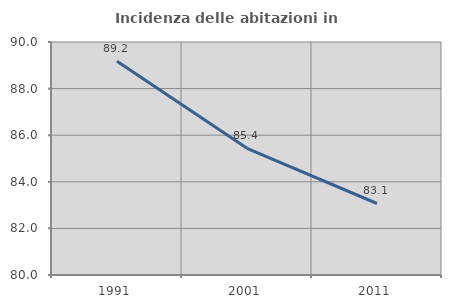
| Category | Incidenza delle abitazioni in proprietà  |
|---|---|
| 1991.0 | 89.175 |
| 2001.0 | 85.437 |
| 2011.0 | 83.069 |